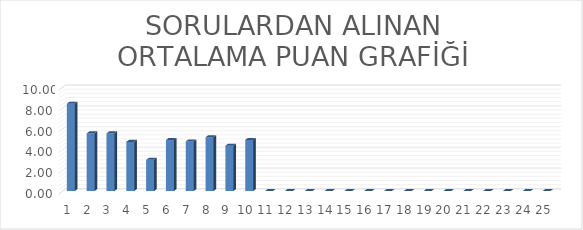
| Category | Series 0 |
|---|---|
| 0 | 8.409 |
| 1 | 5.545 |
| 2 | 5.545 |
| 3 | 4.727 |
| 4 | 3 |
| 5 | 4.909 |
| 6 | 4.773 |
| 7 | 5.182 |
| 8 | 4.364 |
| 9 | 4.914 |
| 10 | 0 |
| 11 | 0 |
| 12 | 0 |
| 13 | 0 |
| 14 | 0 |
| 15 | 0 |
| 16 | 0 |
| 17 | 0 |
| 18 | 0 |
| 19 | 0 |
| 20 | 0 |
| 21 | 0 |
| 22 | 0 |
| 23 | 0 |
| 24 | 0 |